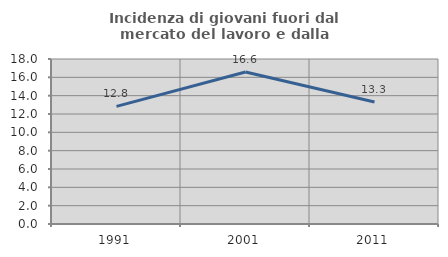
| Category | Incidenza di giovani fuori dal mercato del lavoro e dalla formazione  |
|---|---|
| 1991.0 | 12.836 |
| 2001.0 | 16.583 |
| 2011.0 | 13.317 |